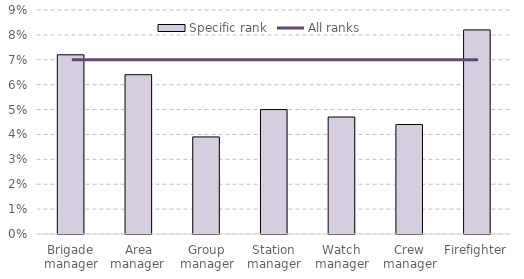
| Category | Specific rank |
|---|---|
| Brigade manager | 0.072 |
| Area manager  | 0.064 |
| Group manager | 0.039 |
| Station manager | 0.05 |
| Watch manager | 0.047 |
| Crew manager | 0.044 |
| Firefighter | 0.082 |